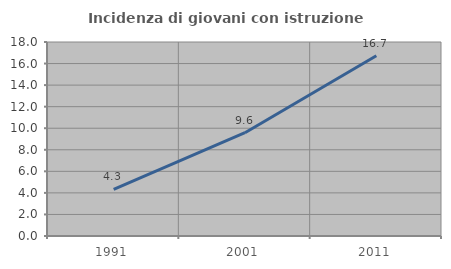
| Category | Incidenza di giovani con istruzione universitaria |
|---|---|
| 1991.0 | 4.319 |
| 2001.0 | 9.585 |
| 2011.0 | 16.727 |